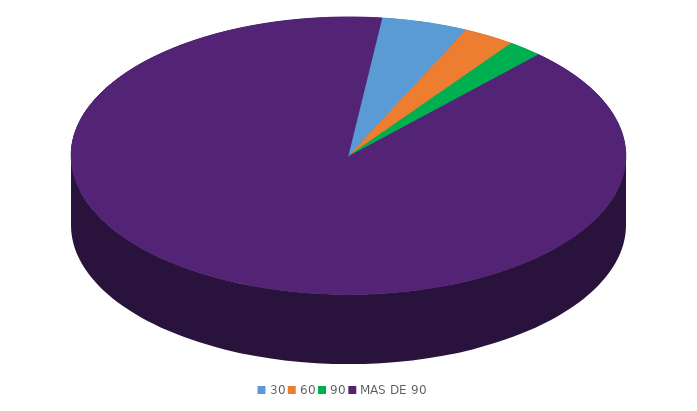
| Category | Series 0 |
|---|---|
| 30 | 1610874.8 |
| 60 | 966524.9 |
| 90 | 644349.9 |
| MAS DE 90 | 28995745.9 |